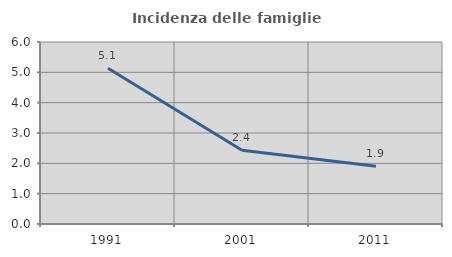
| Category | Incidenza delle famiglie numerose |
|---|---|
| 1991.0 | 5.137 |
| 2001.0 | 2.43 |
| 2011.0 | 1.901 |